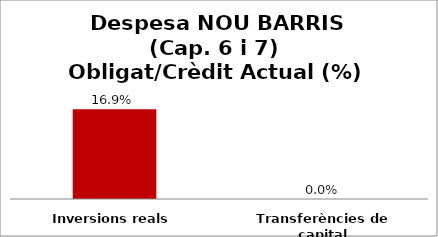
| Category | Series 0 |
|---|---|
| Inversions reals | 0.169 |
| Transferències de capital | 0 |